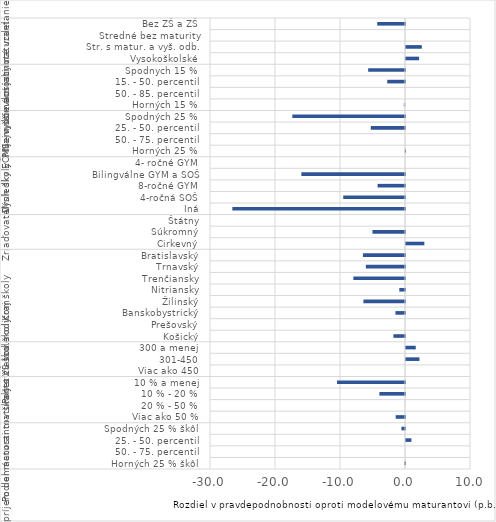
| Category | Rozdiel (p.b.) |
|---|---|
| 0 | -0.106 |
| 1 | 0 |
| 2 | 0.836 |
| 3 | -0.55 |
| 4 | -1.438 |
| 5 | 0 |
| 6 | -3.943 |
| 7 | -10.452 |
| 8 | 0 |
| 9 | 2.071 |
| 10 | 1.504 |
| 11 | -1.785 |
| 12 | 0 |
| 13 | -1.473 |
| 14 | -6.395 |
| 15 | -0.878 |
| 16 | -7.951 |
| 17 | -6.029 |
| 18 | -6.472 |
| 19 | 2.824 |
| 20 | -5.009 |
| 21 | 0 |
| 22 | -26.563 |
| 23 | -9.503 |
| 24 | -4.214 |
| 25 | -15.943 |
| 26 | 0 |
| 27 | -0.013 |
| 28 | 0 |
| 29 | -5.263 |
| 30 | -17.339 |
| 31 | -0.246 |
| 32 | 0 |
| 33 | -2.731 |
| 34 | -5.67 |
| 35 | 2.013 |
| 36 | 2.437 |
| 37 | 0 |
| 38 | -4.271 |